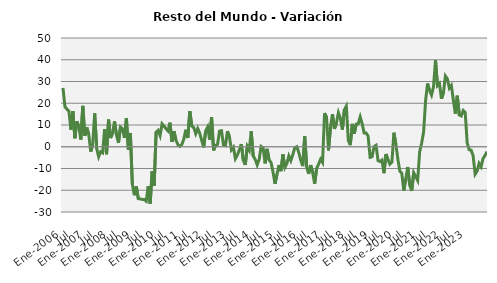
| Category | Series 0 |
|---|---|
| Ene-2006 | 27.054 |
|  | 18.386 |
|  | 17.25 |
|  | 16.383 |
|  | 7.86 |
|  | 16.356 |
| Jul | 3.891 |
|  | 11.695 |
|  | 9.242 |
|  | 3.305 |
|  | 18.779 |
|  | 4.985 |
| Ene-2007 | 8.87 |
|  | 5.687 |
|  | -2.216 |
|  | 1.218 |
|  | 15.315 |
|  | -0.796 |
| Jul | -4.596 |
|  | -2.282 |
|  | -2.809 |
|  | 8.101 |
|  | -3.452 |
|  | 12.495 |
| Ene-2008 | 4.007 |
|  | 6.213 |
|  | 11.669 |
|  | 5.427 |
|  | 1.752 |
|  | 9.055 |
| Jul | 8.315 |
|  | 4.04 |
|  | 13.032 |
|  | -1.375 |
|  | 6.35 |
|  | -17.135 |
| Ene-2009 | -22.274 |
|  | -18.238 |
|  | -23.878 |
|  | -23.97 |
|  | -24.224 |
|  | -24.232 |
| Jul | -25.025 |
|  | -18.167 |
|  | -26.16 |
|  | -11.346 |
|  | -18.045 |
|  | 6.69 |
| Ene-2010 | 7.535 |
|  | 5.116 |
|  | 10.537 |
|  | 9.474 |
|  | 8.279 |
|  | 7.257 |
| Jul | 11.079 |
|  | 2.218 |
|  | 7.164 |
|  | 3.041 |
|  | 0.985 |
|  | 0.164 |
| Ene-2011 | 1.061 |
|  | 3.581 |
|  | 7.83 |
|  | 4.03 |
|  | 16.327 |
|  | 9.513 |
| Jul | 8.808 |
|  | 5.984 |
|  | 8.392 |
|  | 6.266 |
|  | 2.969 |
|  | -0.301 |
| Ene-2012 | 7.276 |
|  | 9.057 |
|  | 3.289 |
|  | 13.635 |
|  | -1.661 |
|  | 0.59 |
| Jul | 1.089 |
|  | 7.164 |
|  | 7.374 |
|  | 0.699 |
|  | 0.478 |
|  | 7.189 |
| Ene-2013 | 4.577 |
|  | -1.426 |
|  | -0.213 |
|  | -5.489 |
|  | -3.868 |
|  | -1.39 |
| Jul | 1.241 |
|  | -6.224 |
|  | -8.347 |
|  | 0.159 |
|  | -1.601 |
|  | 7.073 |
| Ene-2014 | -4.272 |
|  | -5.793 |
|  | -8.359 |
|  | -5.901 |
|  | 0.15 |
|  | -0.471 |
| Jul | -7.646 |
|  | -0.952 |
|  | -6.092 |
|  | -7.207 |
|  | -11.632 |
|  | -17.062 |
| Ene-2015 | -12.724 |
|  | -8.409 |
|  | -11.228 |
|  | -3.527 |
|  | -9.491 |
|  | -7.709 |
| Jul | -4.199 |
|  | -6.397 |
|  | -3.595 |
|  | -0.393 |
|  | 0.039 |
|  | -2.591 |
| Ene-2016 | -6.215 |
|  | -8.875 |
|  | 4.828 |
|  | -9.404 |
|  | -12.486 |
|  | -8.432 |
| Jul | -11.798 |
|  | -17.018 |
|  | -10.015 |
|  | -7.955 |
|  | -5.751 |
|  | -7.24 |
| Ene-2017 | 15.42 |
|  | 13.626 |
|  | -1.675 |
|  | 9.052 |
|  | 14.994 |
|  | 8.196 |
| Jul | 10.893 |
|  | 15.687 |
|  | 13.154 |
|  | 7.84 |
|  | 16.984 |
|  | 18.649 |
| Ene-2018 | 2.908 |
|  | 0.75 |
|  | 10.508 |
|  | 6.02 |
|  | 10.371 |
|  | 10.574 |
| Jul | 13.717 |
|  | 10.531 |
|  | 6.317 |
|  | 6.314 |
|  | 4.869 |
|  | -4.885 |
| Ene-2019 | -4.584 |
|  | 0.095 |
|  | 0.685 |
|  | -6.344 |
|  | -6.803 |
|  | -6.107 |
| Jul | -12.162 |
|  | -3.344 |
|  | -5.829 |
|  | -8.015 |
|  | -7.08 |
|  | 6.447 |
| Ene-2020 | 1.176 |
|  | -5.676 |
|  | -11.207 |
|  | -12.196 |
|  | -20.194 |
|  | -14.786 |
| Jul | -9.317 |
|  | -17.718 |
|  | -20.321 |
|  | -11.951 |
|  | -13.756 |
|  | -15.51 |
| Ene-2021 | -2.36 |
|  | 1.583 |
|  | 6.733 |
|  | 21.247 |
|  | 29.058 |
|  | 25.859 |
| Jul | 23.764 |
|  | 27.574 |
|  | 39.844 |
|  | 28.1 |
|  | 29.077 |
|  | 22.1 |
| Ene-2022 | 24.749 |
|  | 32.516 |
|  | 31.193 |
|  | 26.952 |
|  | 28.165 |
|  | 21.516 |
| Jul | 15.255 |
|  | 23.455 |
|  | 14.616 |
|  | 14.17 |
|  | 16.662 |
|  | 15.767 |
| Ene-2023 | 1.665 |